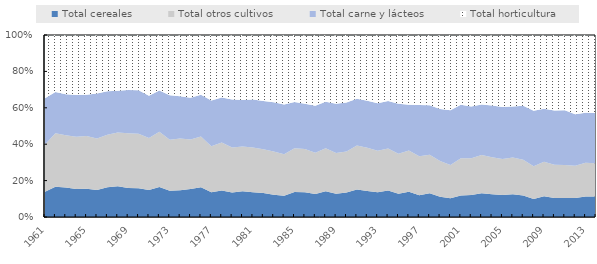
| Category | Total cereales | Total otros cultivos | Total carne y lácteos | Total horticultura |
|---|---|---|---|---|
| 1961.0 | 3034960.784 | 5657135.928 | 5566558.133 | 7584675.303 |
| 1962.0 | 4144258.215 | 7372814.939 | 5650249.094 | 7823772.739 |
| 1963.0 | 4084024.032 | 7284433.626 | 5689488.777 | 8223590.063 |
| 1964.0 | 3899503.555 | 7283754.641 | 5823404.326 | 8363113.118 |
| 1965.0 | 4163618.508 | 7777962.395 | 6060612.002 | 8809885.577 |
| 1966.0 | 3740926.753 | 7098270.793 | 6253012.934 | 8075241.092 |
| 1967.0 | 4392280.999 | 7781435.448 | 6449307.555 | 8335736.987 |
| 1968.0 | 4971633.794 | 8700334.563 | 6736062.228 | 9028061.182 |
| 1969.0 | 4639226.92 | 8749350.144 | 6903943.917 | 8775884.089 |
| 1970.0 | 4602086.213 | 8766641.998 | 7001938.547 | 8865749.671 |
| 1971.0 | 4612673.825 | 8860711.422 | 7186022.49 | 10373258.303 |
| 1972.0 | 5359979.41 | 9921073.298 | 7378587.518 | 9920450.014 |
| 1973.0 | 4450640.146 | 8728300.641 | 7578487.358 | 10243929.45 |
| 1974.0 | 5008002.125 | 9635629.611 | 7843068.809 | 11436157.065 |
| 1975.0 | 5358200.592 | 9547918.582 | 8014050.515 | 12030033.184 |
| 1976.0 | 5942771.225 | 10197046.621 | 8365435.688 | 11958280.518 |
| 1977.0 | 4693963.641 | 8809597.469 | 8714580.228 | 12468133.457 |
| 1978.0 | 5421844.737 | 9819419.602 | 9232905.621 | 12768538.059 |
| 1979.0 | 4995774.91 | 9120480.889 | 9736374.338 | 13085918.319 |
| 1980.0 | 5635335.116 | 9812697.557 | 10185623.628 | 14245084.408 |
| 1981.0 | 5559259.872 | 10080045.664 | 10797547.232 | 14522693.125 |
| 1982.0 | 5687945.983 | 10387291.111 | 11424295.538 | 15621209.01 |
| 1983.0 | 5336751.82 | 10271839.219 | 11778550.689 | 16037051.3 |
| 1984.0 | 5090554.77 | 9957000.722 | 11908358.464 | 16655664.531 |
| 1985.0 | 6757698.902 | 11905561.61 | 12553220.525 | 18149223.538 |
| 1986.0 | 7105938.87 | 12422468.222 | 13003081.965 | 19758034.384 |
| 1987.0 | 6489653.263 | 11619296.143 | 13254369.767 | 19988299.264 |
| 1988.0 | 7667573.872 | 12884929.385 | 13874352.252 | 19922448.628 |
| 1989.0 | 6859462.022 | 12032839.971 | 14589637.719 | 20311419.051 |
| 1990.0 | 8046046.469 | 13431866.622 | 16158953.804 | 22133193.23 |
| 1991.0 | 9571795.016 | 15372743.855 | 16326230.746 | 22308981.307 |
| 1992.0 | 9412845.934 | 15699258.928 | 17037285.804 | 23897119.234 |
| 1993.0 | 9109362.978 | 15309183.197 | 17496760.579 | 25130945.031 |
| 1994.0 | 10205584.361 | 16233771.524 | 18431612.068 | 25458644.508 |
| 1995.0 | 8971824.203 | 15377814.461 | 19245091.444 | 26437892.106 |
| 1996.0 | 11066151.669 | 18165794.536 | 20080695.197 | 30627968.244 |
| 1997.0 | 9178784.047 | 16323135.866 | 21493688.281 | 29451003.267 |
| 1998.0 | 10757349.262 | 17386838.118 | 22408762.001 | 31739456.829 |
| 1999.0 | 9031264.46 | 16001313.768 | 23218380.652 | 33113582.914 |
| 2000.0 | 8323676.64 | 14840525.115 | 24424822.105 | 33533369.682 |
| 2001.0 | 9970310.451 | 17397598.871 | 24884084.565 | 32553962.65 |
| 2002.0 | 11061979.19 | 18428075.517 | 25857451.242 | 35828286.903 |
| 2003.0 | 12659023.427 | 20332678.133 | 26957797.896 | 36957334.288 |
| 2004.0 | 12297953.982 | 19973165.604 | 27963336.187 | 38016835.682 |
| 2005.0 | 12377446.706 | 20115273.838 | 29202999.925 | 40425580.868 |
| 2006.0 | 13323216.306 | 21559548.606 | 29959877.372 | 41978577.491 |
| 2007.0 | 12425456.807 | 20745775.6 | 31220864.14 | 40949602.39 |
| 2008.0 | 10179848.522 | 18437670.882 | 31300896.634 | 42776951.281 |
| 2009.0 | 12582844.54 | 20942259.181 | 32150516.688 | 44859926.15 |
| 2010.0 | 11276584.491 | 19720406.832 | 32295231.05 | 44813844.14 |
| 2011.0 | 11449580.374 | 19926890.208 | 33076383.672 | 45487019.481 |
| 2012.0 | 11254999.559 | 19012260.736 | 30473439.11 | 46825009.676 |
| 2013.0 | 12550785.67 | 20463495.614 | 30514266.717 | 47429056.518 |
| 2014.0 | 12342077.936 | 20267092.175 | 30406841.834 | 47314582.492 |